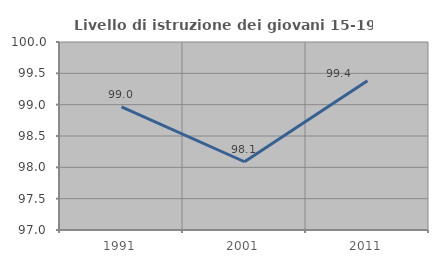
| Category | Livello di istruzione dei giovani 15-19 anni |
|---|---|
| 1991.0 | 98.966 |
| 2001.0 | 98.089 |
| 2011.0 | 99.383 |